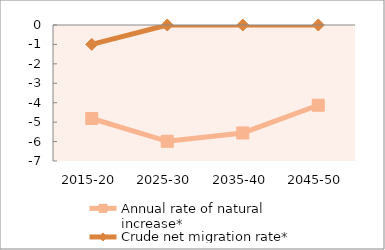
| Category | Annual rate of natural increase* | Crude net migration rate* |
|---|---|---|
| 2015-20 | -4.813 | -0.999 |
| 2025-30 | -5.986 | 0 |
| 2035-40 | -5.557 | 0 |
| 2045-50 | -4.13 | 0 |